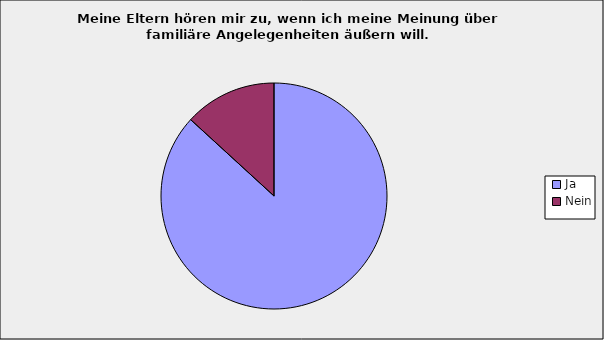
| Category | Series 0 |
|---|---|
| Ja | 0.868 |
| Nein | 0.132 |